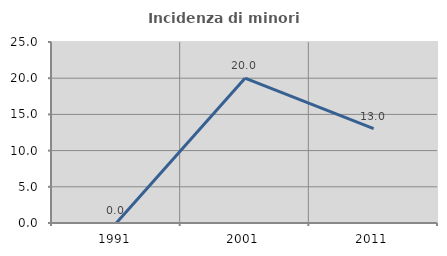
| Category | Incidenza di minori stranieri |
|---|---|
| 1991.0 | 0 |
| 2001.0 | 20 |
| 2011.0 | 13.043 |